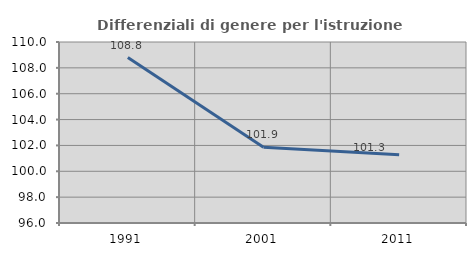
| Category | Differenziali di genere per l'istruzione superiore |
|---|---|
| 1991.0 | 108.795 |
| 2001.0 | 101.861 |
| 2011.0 | 101.271 |